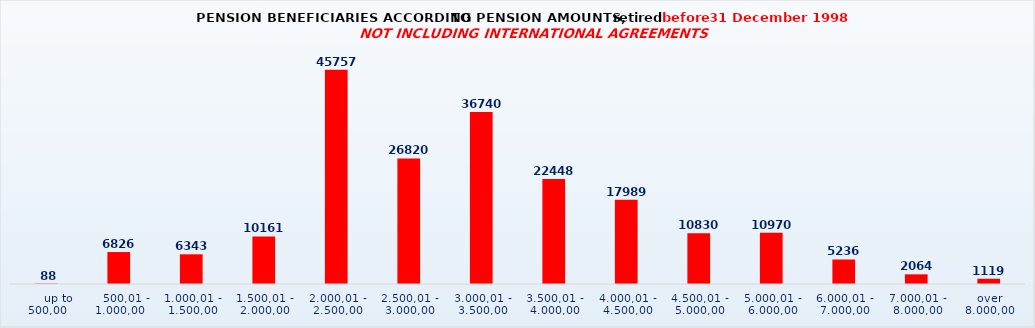
| Category | Series 0 |
|---|---|
|      up to 500,00 | 88 |
|    500,01 - 1.000,00 | 6826 |
| 1.000,01 - 1.500,00 | 6343 |
| 1.500,01 - 2.000,00 | 10161 |
| 2.000,01 - 2.500,00 | 45757 |
| 2.500,01 - 3.000,00 | 26820 |
| 3.000,01 - 3.500,00 | 36740 |
| 3.500,01 - 4.000,00 | 22448 |
| 4.000,01 - 4.500,00 | 17989 |
| 4.500,01 - 5.000,00 | 10830 |
| 5.000,01 - 6.000,00 | 10970 |
| 6.000,01 - 7.000,00 | 5236 |
| 7.000,01 - 8.000,00 | 2064 |
| over 8.000,00 | 1119 |